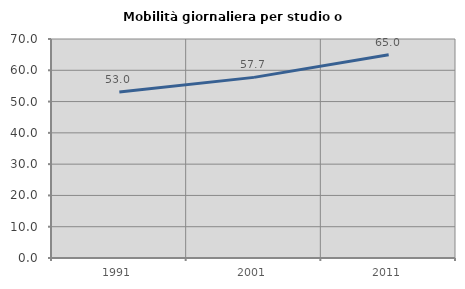
| Category | Mobilità giornaliera per studio o lavoro |
|---|---|
| 1991.0 | 53.038 |
| 2001.0 | 57.736 |
| 2011.0 | 64.954 |